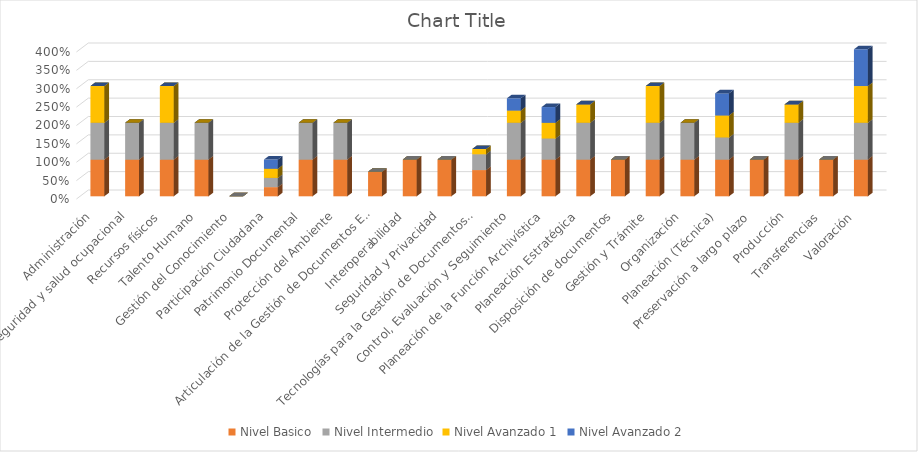
| Category | Nivel Inicial | Nivel Basico | Nivel Intermedio | Nivel Avanzado 1 | Nivel Avanzado 2 |
|---|---|---|---|---|---|
| Administración |  | 1 | 1 | 1 | 0 |
| Gestión en seguridad y salud ocupacional |  | 1 | 1 | 0 | 0 |
| Recursos físicos |  | 1 | 1 | 1 | 0 |
| Talento Humano |  | 1 | 1 | 0 | 0 |
| Gestión del Conocimiento |  | 0 | 0 | 0 | 0 |
| Participación Ciudadana |  | 0.25 | 0.25 | 0.25 | 0.25 |
| Patrimonio Documental |  | 1 | 1 | 0 | 0 |
| Protección del Ambiente |  | 1 | 1 | 0 | 0 |
| Articulación de la Gestión de Documentos Electrónicos |  | 0.667 | 0 | 0 | 0 |
| Interoperabilidad |  | 1 | 0 | 0 | 0 |
| Seguridad y Privacidad |  | 1 | 0 | 0 | 0 |
| Tecnologías para la Gestión de Documentos Electrónicos |  | 0.714 | 0.429 | 0.143 | 0 |
| Control, Evaluación y Seguimiento |  | 1 | 1 | 0.333 | 0.333 |
| Planeación de la Función Archivística |  | 1 | 0.571 | 0.429 | 0.429 |
| Planeación Estratégica |  | 1 | 1 | 0.5 | 0 |
| Disposición de documentos |  | 1 | 0 | 0 | 0 |
| Gestión y Trámite |  | 1 | 1 | 1 | 0 |
| Organización |  | 1 | 1 | 0 | 0 |
| Planeación (Técnica) |  | 1 | 0.6 | 0.6 | 0.6 |
| Preservación a largo plazo |  | 1 | 0 | 0 | 0 |
| Producción |  | 1 | 1 | 0.5 | 0 |
| Transferencias |  | 1 | 0 | 0 | 0 |
| Valoración |  | 1 | 1 | 1 | 1 |